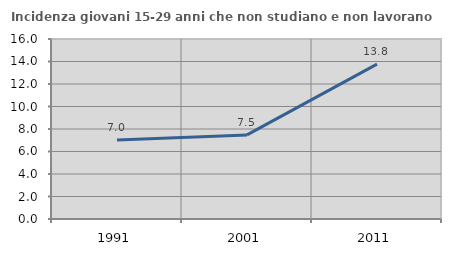
| Category | Incidenza giovani 15-29 anni che non studiano e non lavorano  |
|---|---|
| 1991.0 | 7.031 |
| 2001.0 | 7.477 |
| 2011.0 | 13.764 |